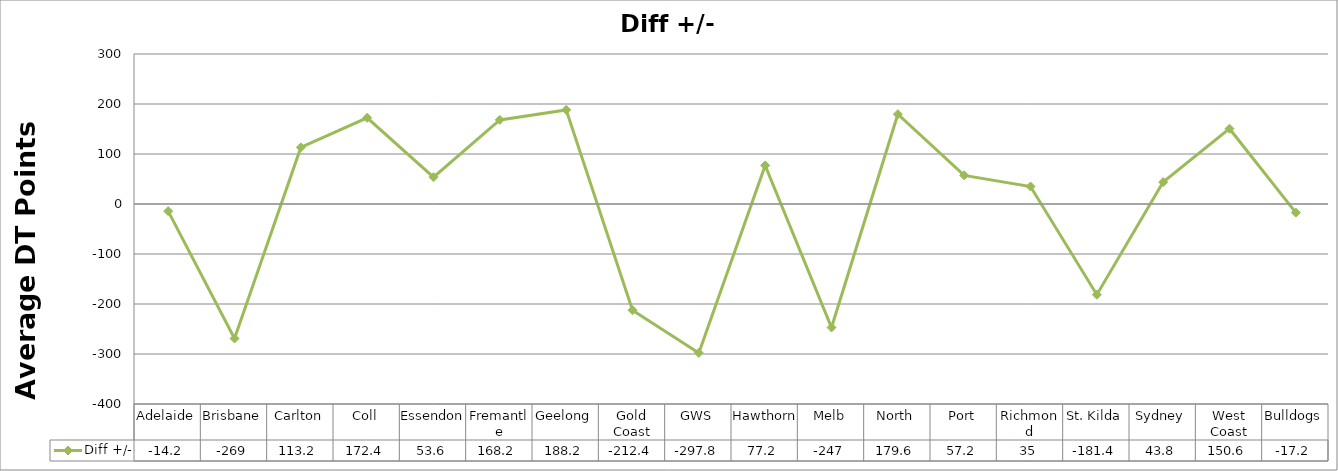
| Category | Diff +/- |
|---|---|
| Adelaide | -14.2 |
| Brisbane | -269 |
| Carlton | 113.2 |
| Coll | 172.4 |
| Essendon | 53.6 |
| Fremantle | 168.2 |
| Geelong | 188.2 |
| Gold Coast | -212.4 |
| GWS | -297.8 |
| Hawthorn | 77.2 |
| Melb | -247 |
| North | 179.6 |
| Port | 57.2 |
| Richmond | 35 |
| St. Kilda | -181.4 |
| Sydney | 43.8 |
| West Coast | 150.6 |
| Bulldogs | -17.2 |